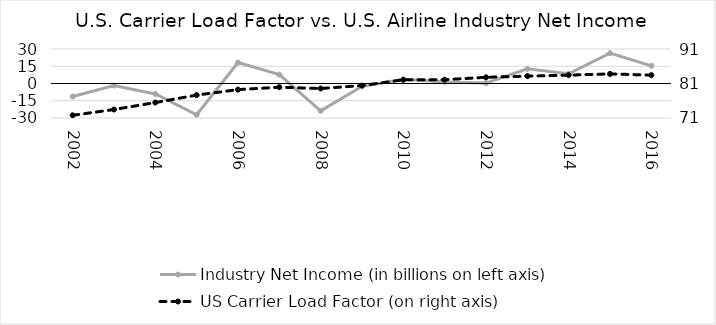
| Category | Industry Net Income (in billions on left axis) |
|---|---|
| 2002.0 | -11.365 |
| 2003.0 | -1.715 |
| 2004.0 | -9.104 |
| 2005.0 | -27.22 |
| 2006.0 | 18.186 |
| 2007.0 | 7.691 |
| 2008.0 | -23.75 |
| 2009.0 | -2.526 |
| 2010.0 | 3.666 |
| 2011.0 | 1.392 |
| 2012.0 | 0.364 |
| 2013.0 | 12.711 |
| 2014.0 | 8.505 |
| 2015.0 | 26.383 |
| 2016.0 | 15.383 |